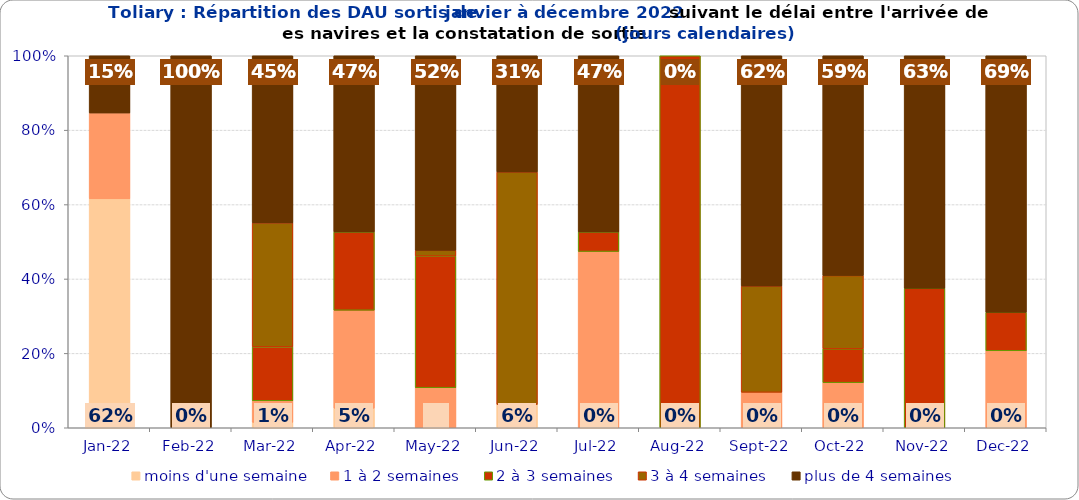
| Category | moins d'une semaine | 1 à 2 semaines | 2 à 3 semaines | 3 à 4 semaines | plus de 4 semaines |
|---|---|---|---|---|---|
| 2022-01-01 | 0.615 | 0.231 | 0 | 0 | 0.154 |
| 2022-02-01 | 0 | 0 | 0 | 0 | 1 |
| 2022-03-01 | 0.014 | 0.058 | 0.145 | 0.333 | 0.449 |
| 2022-04-01 | 0.053 | 0.263 | 0.211 | 0 | 0.474 |
| 2022-05-01 | 0 | 0.108 | 0.354 | 0.015 | 0.523 |
| 2022-06-01 | 0.062 | 0 | 0 | 0.625 | 0.312 |
| 2022-07-01 | 0 | 0.474 | 0.053 | 0 | 0.474 |
| 2022-08-01 | 0 | 0 | 1 | 0 | 0 |
| 2022-09-01 | 0 | 0.095 | 0 | 0.286 | 0.619 |
| 2022-10-01 | 0 | 0.121 | 0.091 | 0.197 | 0.591 |
| 2022-11-01 | 0 | 0 | 0.375 | 0 | 0.625 |
| 2022-12-01 | 0 | 0.207 | 0.103 | 0 | 0.69 |